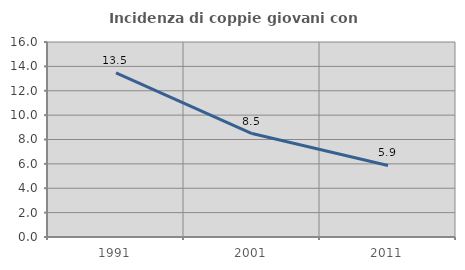
| Category | Incidenza di coppie giovani con figli |
|---|---|
| 1991.0 | 13.474 |
| 2001.0 | 8.49 |
| 2011.0 | 5.871 |